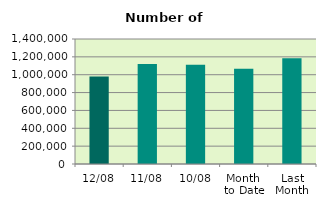
| Category | Series 0 |
|---|---|
| 12/08 | 981144 |
| 11/08 | 1119364 |
| 10/08 | 1111262 |
| Month 
to Date | 1066563.6 |
| Last
Month | 1183989.81 |